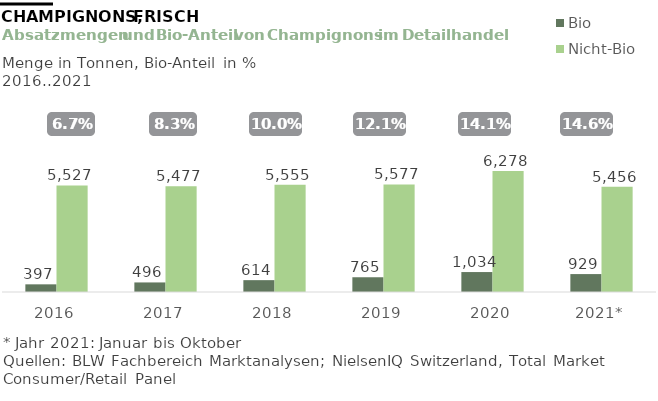
| Category | Bio | Nicht-Bio |
|---|---|---|
| 2016 | 397.402 | 5527.481 |
| 2017 | 496.056 | 5476.995 |
| 2018 | 614.377 | 5554.73 |
| 2019 | 764.915 | 5577.277 |
| 2020 | 1034.383 | 6278.036 |
| 2021* | 929.274 | 5456.002 |